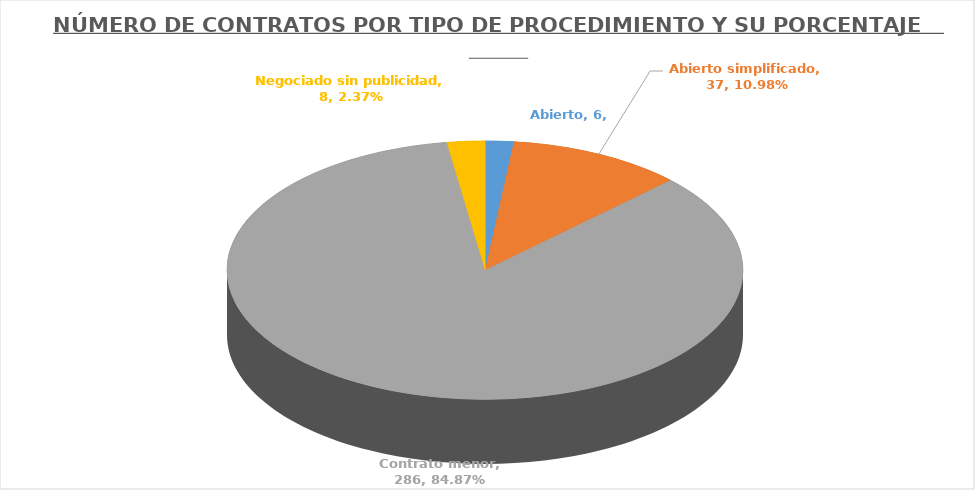
| Category | NÚMERO DE CONTRATOS | PORCENTAJE DE CONTRATOS |
|---|---|---|
| Abierto | 6 | 0.018 |
| Abierto simplificado | 37 | 0.11 |
| Contrato menor | 286 | 0.849 |
| Negociado sin publicidad | 8 | 0.024 |